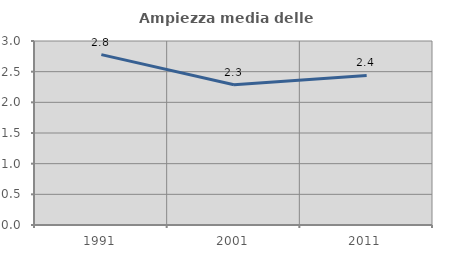
| Category | Ampiezza media delle famiglie |
|---|---|
| 1991.0 | 2.778 |
| 2001.0 | 2.287 |
| 2011.0 | 2.438 |